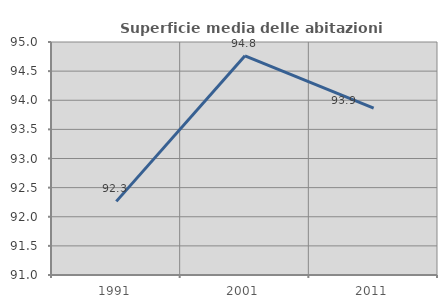
| Category | Superficie media delle abitazioni occupate |
|---|---|
| 1991.0 | 92.264 |
| 2001.0 | 94.762 |
| 2011.0 | 93.867 |